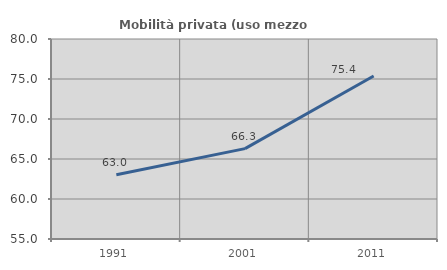
| Category | Mobilità privata (uso mezzo privato) |
|---|---|
| 1991.0 | 63.04 |
| 2001.0 | 66.296 |
| 2011.0 | 75.368 |